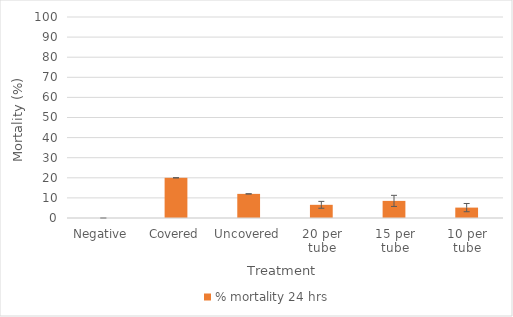
| Category | % mortality 24 hrs |
|---|---|
| Negative  | 0 |
| Covered | 20 |
| Uncovered | 12 |
| 20 per tube | 6.557 |
| 15 per tube | 8.511 |
| 10 per tube | 5.172 |